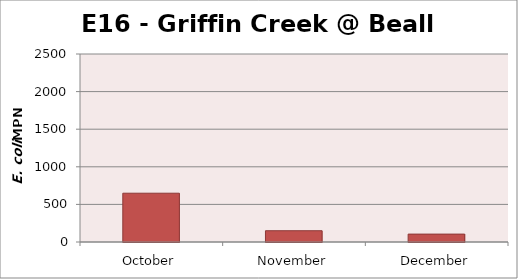
| Category | Series 0 |
|---|---|
| October | 648.8 |
| November | 150 |
| December | 105 |